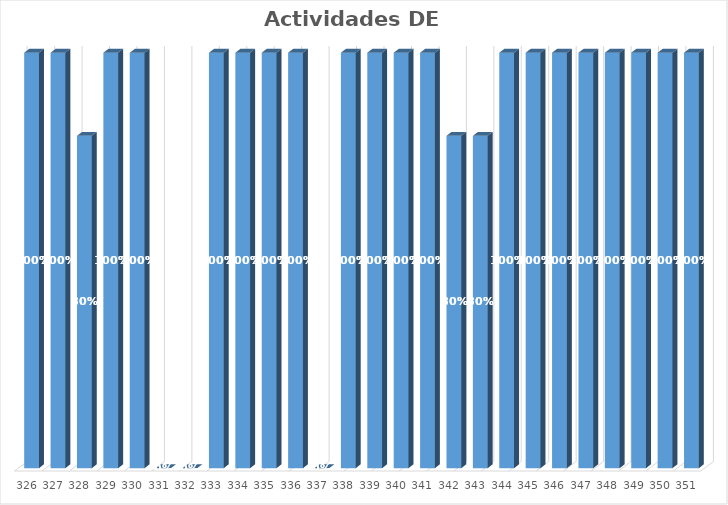
| Category | % Avance |
|---|---|
| 326.0 | 1 |
| 327.0 | 1 |
| 328.0 | 0.8 |
| 329.0 | 1 |
| 330.0 | 1 |
| 331.0 | 0 |
| 332.0 | 0 |
| 333.0 | 1 |
| 334.0 | 1 |
| 335.0 | 1 |
| 336.0 | 1 |
| 337.0 | 0 |
| 338.0 | 1 |
| 339.0 | 1 |
| 340.0 | 1 |
| 341.0 | 1 |
| 342.0 | 0.8 |
| 343.0 | 0.8 |
| 344.0 | 1 |
| 345.0 | 1 |
| 346.0 | 1 |
| 347.0 | 1 |
| 348.0 | 1 |
| 349.0 | 1 |
| 350.0 | 1 |
| 351.0 | 1 |